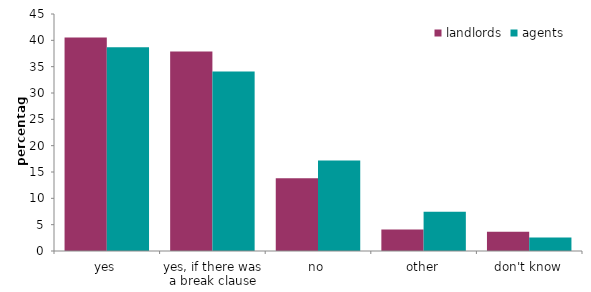
| Category | landlords | agents |
|---|---|---|
| yes | 40.529 | 38.7 |
| yes, if there was a break clause | 37.867 | 34.084 |
| no | 13.83 | 17.195 |
| other | 4.099 | 7.457 |
| don't know | 3.675 | 2.564 |